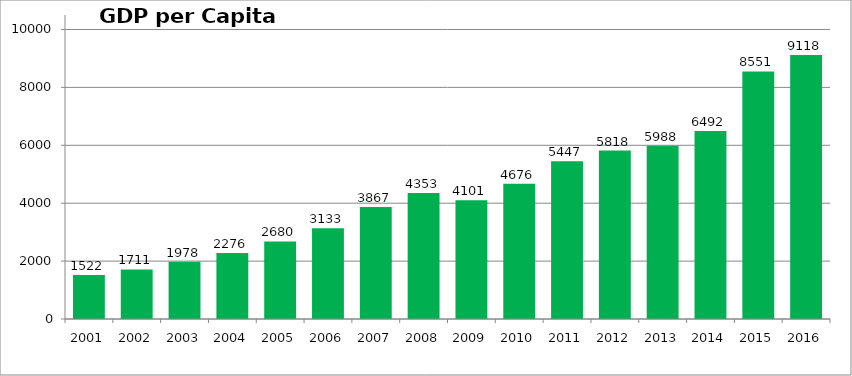
| Category | GDP per Capita (GEL) |
|---|---|
| 2001.0 | 1521.809 |
| 2002.0 | 1711.229 |
| 2003.0 | 1977.861 |
| 2004.0 | 2275.538 |
| 2005.0 | 2679.766 |
| 2006.0 | 3133.145 |
| 2007.0 | 3866.88 |
| 2008.0 | 4352.902 |
| 2009.0 | 4101.326 |
| 2010.0 | 4675.72 |
| 2011.0 | 5447.057 |
| 2012.0 | 5818.055 |
| 2013.0 | 5987.634 |
| 2014.0 | 6491.6 |
| 2015.0 | 8550.79 |
| 2016.0 | 9118 |